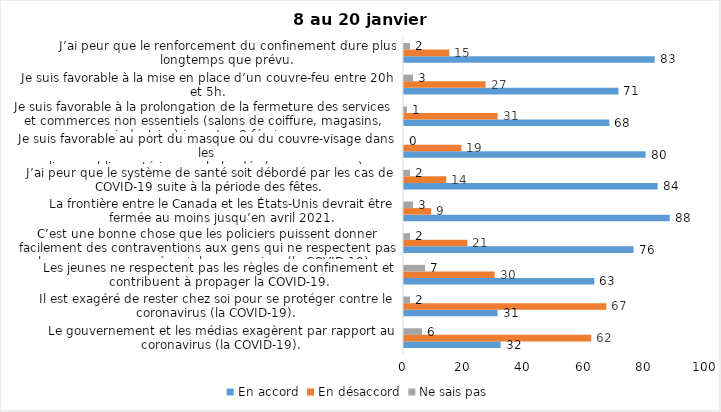
| Category | En accord | En désaccord | Ne sais pas |
|---|---|---|---|
| Le gouvernement et les médias exagèrent par rapport au coronavirus (la COVID-19). | 32 | 62 | 6 |
| Il est exagéré de rester chez soi pour se protéger contre le coronavirus (la COVID-19). | 31 | 67 | 2 |
| Les jeunes ne respectent pas les règles de confinement et contribuent à propager la COVID-19. | 63 | 30 | 7 |
| C’est une bonne chose que les policiers puissent donner facilement des contraventions aux gens qui ne respectent pas les mesures pour prévenir le coronavirus (la COVID-19). | 76 | 21 | 2 |
| La frontière entre le Canada et les États-Unis devrait être fermée au moins jusqu’en avril 2021. | 88 | 9 | 3 |
| J’ai peur que le système de santé soit débordé par les cas de COVID-19 suite à la période des fêtes. | 84 | 14 | 2 |
| Je suis favorable au port du masque ou du couvre-visage dans les
lieux publics extérieurs achalandés (ex. rues, parcs) | 80 | 19 | 0 |
| Je suis favorable à la prolongation de la fermeture des services et commerces non essentiels (salons de coiffure, magasins, industries) jusqu’au 8 février. | 68 | 31 | 1 |
| Je suis favorable à la mise en place d’un couvre-feu entre 20h et 5h. | 71 | 27 | 3 |
| J’ai peur que le renforcement du confinement dure plus longtemps que prévu. | 83 | 15 | 2 |